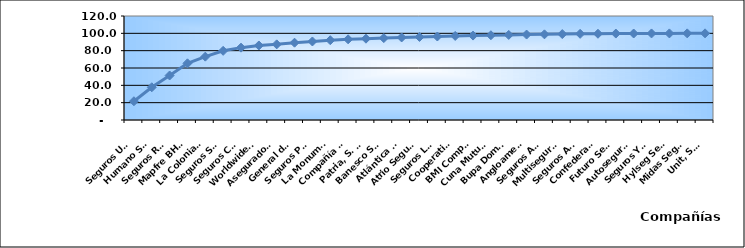
| Category | Series 0 |
|---|---|
| Seguros Universal, S. A. | 21.649 |
| Humano Seguros, S. A. | 37.763 |
| Seguros Reservas, S. A. | 51.35 |
| Mapfre BHD Compañía de Seguros | 65.41 |
| La Colonial, S. A., Compañia De Seguros | 73.106 |
| Seguros Sura, S.A. | 79.813 |
| Seguros Crecer, S. A. | 83.484 |
| Worldwide Seguros, S. A. | 85.986 |
| Aseguradora Agropecuaria Dominicana, S. A. | 87.28 |
| General de Seguros, S. A. | 89.203 |
| Seguros Pepín, S. A. | 90.604 |
| La Monumental de Seguros, S. A. | 92.079 |
| Compañía Dominicana de Seguros, C. por A. | 93.116 |
| Patria, S. A., Compañía de Seguros | 93.816 |
| Banesco Seguros | 94.506 |
| Atlántica Seguros, S. A. | 95.239 |
| Atrio Seguros S. A. | 95.818 |
| Seguros La Internacional, S. A. | 96.338 |
| Cooperativa Nacional De Seguros, Inc  | 96.984 |
| BMI Compañía de Seguros, S. A. | 97.425 |
| Cuna Mutual Insurance Society Dominicana | 97.793 |
| Bupa Dominicana, S. A. | 98.166 |
| Angloamericana de Seguros, S. A. | 98.588 |
| Seguros APS, S.R.L. | 98.842 |
| Multiseguros Su, S.A. | 99.151 |
| Seguros Ademi, S.A. | 99.412 |
| Confederación del Canadá Dominicana, S. A. | 99.513 |
| Futuro Seguros | 99.744 |
| Autoseguro, S. A. | 99.802 |
| Seguros Yunen, S.A. | 99.864 |
| Hylseg Seguros S.A | 99.908 |
| Midas Seguros, S.A. | 99.964 |
| Unit, S.A. | 100 |